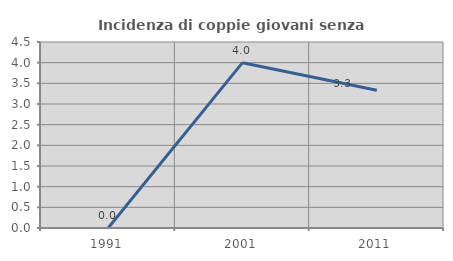
| Category | Incidenza di coppie giovani senza figli |
|---|---|
| 1991.0 | 0 |
| 2001.0 | 4 |
| 2011.0 | 3.333 |